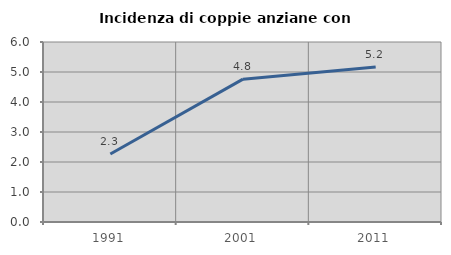
| Category | Incidenza di coppie anziane con figli |
|---|---|
| 1991.0 | 2.267 |
| 2001.0 | 4.762 |
| 2011.0 | 5.164 |